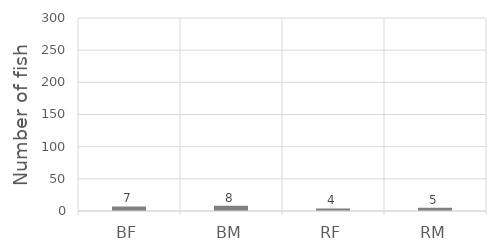
| Category | Series 0 |
|---|---|
| BF | 7 |
| BM | 8 |
| RF | 4 |
| RM | 5 |